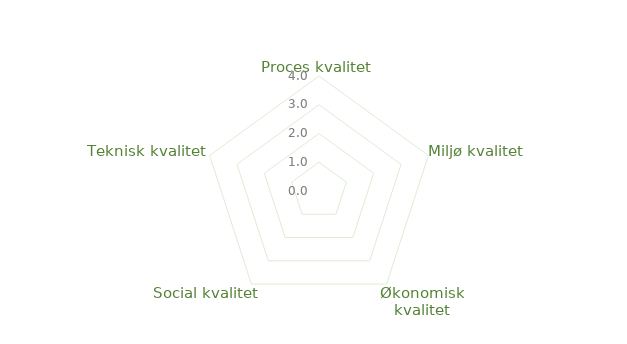
| Category | Series 0 |
|---|---|
| Proces kvalitet | 0 |
| Miljø kvalitet | 0 |
| Økonomisk kvalitet | 0 |
| Social kvalitet | 0 |
| Teknisk kvalitet | 0 |